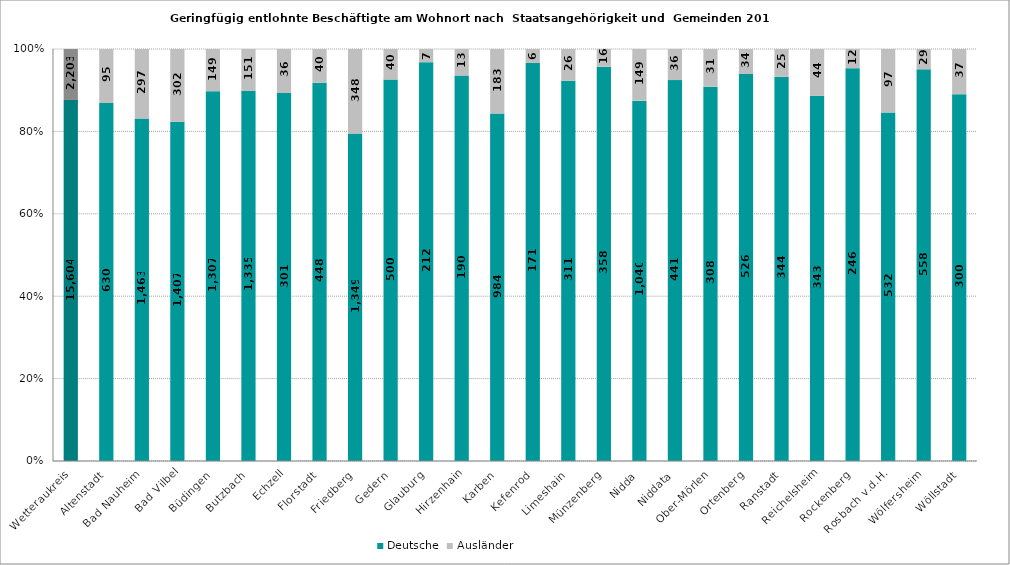
| Category | Deutsche | Ausländer |
|---|---|---|
| Wetteraukreis | 15604 | 2203 |
| Altenstadt | 630 | 95 |
| Bad Nauheim | 1463 | 297 |
| Bad Vilbel | 1407 | 302 |
| Büdingen | 1307 | 149 |
| Butzbach | 1335 | 151 |
| Echzell | 301 | 36 |
| Florstadt | 448 | 40 |
| Friedberg | 1349 | 348 |
| Gedern | 500 | 40 |
| Glauburg | 212 | 7 |
| Hirzenhain | 190 | 13 |
| Karben | 984 | 183 |
| Kefenrod | 171 | 6 |
| Limeshain | 311 | 26 |
| Münzenberg | 358 | 16 |
| Nidda | 1040 | 149 |
| Niddata | 441 | 36 |
| Ober-Mörlen | 308 | 31 |
| Ortenberg | 526 | 34 |
| Ranstadt | 344 | 25 |
| Reichelsheim | 343 | 44 |
| Rockenberg | 246 | 12 |
| Rosbach v.d.H. | 532 | 97 |
| Wölfersheim | 558 | 29 |
| Wöllstadt | 300 | 37 |